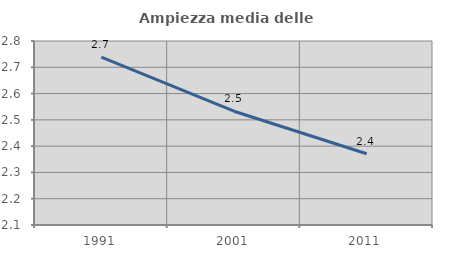
| Category | Ampiezza media delle famiglie |
|---|---|
| 1991.0 | 2.738 |
| 2001.0 | 2.533 |
| 2011.0 | 2.371 |